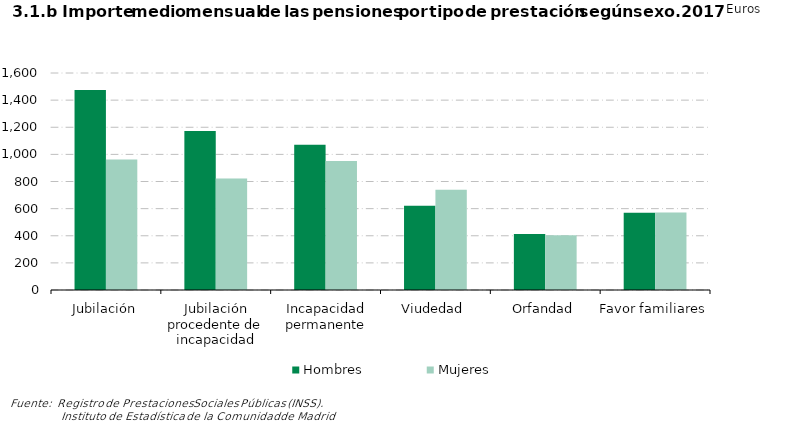
| Category | Hombres | Mujeres |
|---|---|---|
| Jubilación | 1475.139 | 961.989 |
| Jubilación procedente de incapacidad | 1172.272 | 822.411 |
| Incapacidad permanente | 1070.985 | 950.584 |
| Viudedad | 621.253 | 739.526 |
| Orfandad | 412.098 | 404.59 |
| Favor familiares | 569.256 | 572.111 |